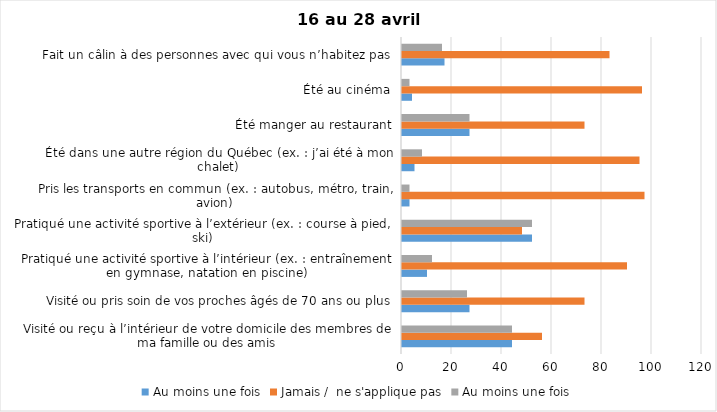
| Category | Au moins une fois | Jamais /  ne s'applique pas |
|---|---|---|
| Visité ou reçu à l’intérieur de votre domicile des membres de ma famille ou des amis | 44 | 56 |
| Visité ou pris soin de vos proches âgés de 70 ans ou plus | 26 | 73 |
| Pratiqué une activité sportive à l’intérieur (ex. : entraînement en gymnase, natation en piscine) | 12 | 90 |
| Pratiqué une activité sportive à l’extérieur (ex. : course à pied, ski) | 52 | 48 |
| Pris les transports en commun (ex. : autobus, métro, train, avion) | 3 | 97 |
| Été dans une autre région du Québec (ex. : j’ai été à mon chalet) | 8 | 95 |
| Été manger au restaurant | 27 | 73 |
| Été au cinéma | 3 | 96 |
| Fait un câlin à des personnes avec qui vous n’habitez pas | 16 | 83 |